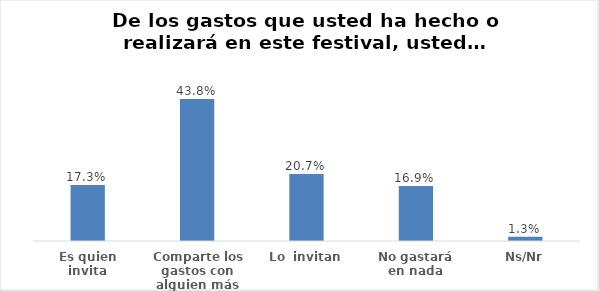
| Category | Series 0 |
|---|---|
| Es quien invita | 0.173 |
| Comparte los gastos con alguien más | 0.438 |
| Lo  invitan | 0.207 |
| No gastará en nada | 0.169 |
| Ns/Nr | 0.013 |